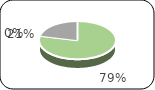
| Category | Series 0 |
|---|---|
| 0 | 86102349.93 |
| 1 | 0 |
| 2 | 23313296.06 |